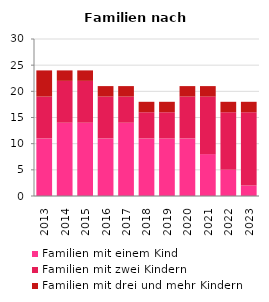
| Category | Familien mit einem Kind | Familien mit zwei Kindern | Familien mit drei und mehr Kindern |
|---|---|---|---|
| 2013.0 | 11 | 8 | 5 |
| 2014.0 | 14 | 8 | 2 |
| 2015.0 | 14 | 8 | 2 |
| 2016.0 | 11 | 8 | 2 |
| 2017.0 | 14 | 5 | 2 |
| 2018.0 | 11 | 5 | 2 |
| 2019.0 | 11 | 5 | 2 |
| 2020.0 | 11 | 8 | 2 |
| 2021.0 | 8 | 11 | 2 |
| 2022.0 | 5 | 11 | 2 |
| 2023.0 | 2 | 14 | 2 |